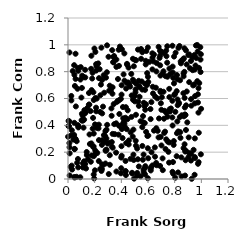
| Category | Series 0 |
|---|---|
| 0.03563302966450452 | 0.805 |
| 0.15725470546570997 | 0.641 |
| 0.30591438788167596 | 0.037 |
| 0.44442905802895954 | 0.851 |
| 0.5340514019186466 | 0.691 |
| 0.07893503927534722 | 0.39 |
| 0.6254720741834504 | 0.573 |
| 0.9351083508665092 | 0.811 |
| 0.5096278023998341 | 0.248 |
| 0.7646215727333777 | 0.503 |
| 0.44600414170575103 | 0.446 |
| 0.7216394145949058 | 0.343 |
| 0.8320018416825582 | 0.561 |
| 0.32900688421911745 | 0.241 |
| 0.709395573126925 | 0.785 |
| 0.2827878612417799 | 0.21 |
| 0.5443690685158465 | 0.43 |
| 0.6652407143829242 | 0.103 |
| 0.4169189847666831 | 0.78 |
| 0.5574837324675022 | 0.246 |
| 0.40282279622567524 | 0.173 |
| 0.6108446168091833 | 0.873 |
| 0.8815692867406937 | 0.477 |
| 0.012519489059148002 | 0.191 |
| 0.10437489069999399 | 0.679 |
| 0.7888248850764427 | 0.039 |
| 0.5953873154129009 | 0.321 |
| 0.1165228921376896 | 0.383 |
| 0.0777591043655525 | 0.384 |
| 0.49057272217372655 | 0.368 |
| 0.5478502889428372 | 0.969 |
| 0.19061189964677616 | 0.646 |
| 0.9052758802610906 | 0.31 |
| 0.07208225706951615 | 0.829 |
| 0.5364906254664229 | 0.686 |
| 0.34676503743022435 | 0.409 |
| 0.34072524804923493 | 0.869 |
| 0.4935841741137938 | 0.84 |
| 0.6264411466432885 | 0.2 |
| 0.07679006643516732 | 0.806 |
| 0.05717907458786809 | 0.298 |
| 0.700557759395515 | 0.516 |
| 0.5834725574929299 | 0.881 |
| 0.07466112687250843 | 0.149 |
| 0.7198555151066441 | 0.449 |
| 0.8417674934536472 | 0.349 |
| 0.04613624099264977 | 0.848 |
| 0.1455468854350774 | 0.529 |
| 0.853430407727154 | 0.475 |
| 0.6325949767257182 | 0.937 |
| 0.20612186753274078 | 0.604 |
| 0.881762902901905 | 0.211 |
| 0.06862611128302931 | 0.121 |
| 0.8667332366656515 | 0.23 |
| 0.5444251770319276 | 0.02 |
| 0.7838020714236587 | 0.053 |
| 0.5240308898563995 | 0.147 |
| 0.8744443689488591 | 0.604 |
| 0.05657004191745656 | 0.934 |
| 0.6447943794131817 | 0.36 |
| 0.2715642921101478 | 0.643 |
| 0.3453617172842169 | 0.917 |
| 0.9234217345973891 | 0.189 |
| 0.2285788836759919 | 0.378 |
| 0.20183481233485892 | 0.065 |
| 0.12916570348441983 | 0.492 |
| 0.8670602330831357 | 0.765 |
| 0.37488271229091713 | 0.745 |
| 0.18407499231285784 | 0.792 |
| 0.20259699793496067 | 0.407 |
| 0.5113440360093787 | 0.711 |
| 0.695132469357539 | 0.313 |
| 0.18132555514791554 | 0.749 |
| 0.24702895944130027 | 0.704 |
| 0.40399143325103937 | 0.372 |
| 0.046087987345045656 | 0.328 |
| 0.506792610633061 | 0.668 |
| 0.9825010202327943 | 0.827 |
| 0.8259075600507771 | 0.049 |
| 0.652661549607466 | 0.166 |
| 0.516196099518228 | 0.023 |
| 0.8726493535969565 | 0.799 |
| 0.8147084099534795 | 0.17 |
| 0.6014727990503329 | 0.154 |
| 0.49056151615090515 | 0.181 |
| 0.19343805210877565 | 0.17 |
| 0.3799780550042329 | 0.963 |
| 0.9100119515219347 | 0.193 |
| 0.27907445741111997 | 0.32 |
| 0.8308764308485884 | 0.569 |
| 0.19651179912720457 | 0.004 |
| 0.8203457588522839 | 0.743 |
| 0.9384938945323787 | 0.697 |
| 0.1983085175587379 | 0.972 |
| 0.9420459151622673 | 0.217 |
| 0.948632118701561 | 0.925 |
| 0.02903005044382853 | 0.363 |
| 0.923114341552792 | 0.595 |
| 0.7459756437684457 | 0.464 |
| 0.4777339687497904 | 0.623 |
| 0.43054982523759133 | 0.057 |
| 0.43170767440450586 | 0.457 |
| 0.2554476945530713 | 0.109 |
| 0.4024363384870739 | 0.699 |
| 0.6966495696412025 | 0.565 |
| 0.1613771927019352 | 0.332 |
| 0.21165359271136697 | 0.808 |
| 0.3963635155993166 | 0.597 |
| 0.46941298226638856 | 0.348 |
| 0.8820308309478597 | 0.14 |
| 0.7824669315075276 | 0.459 |
| 0.44014120768382853 | 0.717 |
| 0.25041341025791447 | 0.979 |
| 0.5015383314833852 | 0.579 |
| 0.7653703418222585 | 0.781 |
| 0.20358605201255797 | 0.186 |
| 0.3630327553735267 | 0.056 |
| 0.8152538842195785 | 0.655 |
| 0.17556850507719263 | 0.175 |
| 0.4328513422570683 | 0.058 |
| 0.010266241414984313 | 0.268 |
| 0.7216116522842217 | 0.938 |
| 0.9221885897266981 | 0.138 |
| 0.5793351780751608 | 0.516 |
| 0.31307573939561534 | 0.695 |
| 0.2138391260776985 | 0.839 |
| 0.3735617436172606 | 0.582 |
| 0.011008889289695527 | 0.943 |
| 0.8846860983848713 | 0.365 |
| 0.2807629415855507 | 0.357 |
| 0.9844252891726221 | 0.715 |
| 0.7968187977232787 | 0.626 |
| 0.43157071224319604 | 0.134 |
| 0.20532045447148634 | 0.947 |
| 0.8225814183010978 | 0.55 |
| 0.7384080433089355 | 0.915 |
| 0.6728793603267023 | 0.359 |
| 0.21057979706823254 | 0.532 |
| 0.5780158165397067 | 0.664 |
| 0.5922188670633197 | 0.7 |
| 0.9788437487020605 | 0.677 |
| 0.5858339328218688 | 0.351 |
| 0.36703647269313144 | 0.575 |
| 0.23711753986353387 | 0.819 |
| 0.569033431424668 | 0.568 |
| 0.040454871515054766 | 0.293 |
| 0.974338953810855 | 0.631 |
| 0.456478630369994 | 0.287 |
| 0.24212569490626637 | 0.076 |
| 0.26909047843936196 | 0.327 |
| 0.7474323135710214 | 0.279 |
| 0.14136893046923868 | 0.178 |
| 0.9495105727749563 | 0.031 |
| 0.5275154171254685 | 0.577 |
| 0.44006459427832584 | 0.372 |
| 0.8386461248547867 | 0.461 |
| 0.6629088393247221 | 0.802 |
| 0.4957352171128078 | 0.003 |
| 0.4938256890846566 | 0.726 |
| 0.38227632549541446 | 0.843 |
| 0.049520682179997846 | 0.011 |
| 0.11745239315813702 | 0.759 |
| 0.7613593107569053 | 0.519 |
| 0.7459999700498012 | 0.762 |
| 0.8854379822208005 | 0.208 |
| 0.2542735645275871 | 0.074 |
| 0.04788185699979842 | 0.419 |
| 0.598978069813513 | 0.98 |
| 0.9795716258534691 | 0.126 |
| 0.2929157352323847 | 0.996 |
| 0.6900919024135728 | 0.955 |
| 0.10059475263461078 | 0.607 |
| 0.26254674912036746 | 0.539 |
| 0.7315642364723096 | 0.223 |
| 0.5481818017063093 | 0.896 |
| 0.5938202570976902 | 0.789 |
| 0.02793645959232622 | 0.1 |
| 0.36150511948355074 | 0.415 |
| 0.48732592023902943 | 0.591 |
| 0.5757007799252084 | 0.417 |
| 0.2676635024097591 | 0.774 |
| 0.12086776030227603 | 0.442 |
| 0.8782469905607037 | 0.026 |
| 0.8405641931578546 | 0.736 |
| 0.7950499140761986 | 0.713 |
| 0.7278126319315674 | 0.353 |
| 0.17115419369886564 | 0.129 |
| 0.022932409541389347 | 0.324 |
| 0.9694812066911285 | 0.729 |
| 0.5367169282239092 | 0.613 |
| 0.17507905280692734 | 0.265 |
| 0.3131967644961714 | 0.177 |
| 0.5669103606655168 | 0.182 |
| 0.1928892950751433 | 0.034 |
| 0.879530991236594 | 0.205 |
| 0.8271180111415063 | 0.354 |
| 0.2882903429011712 | 0.302 |
| 0.4745602771057324 | 0.783 |
| 0.7849345924758124 | 0.838 |
| 0.5025547744859902 | 0.888 |
| 0.6021950732527096 | 0.723 |
| 0.3014052505391087 | 0.271 |
| 0.4358913917001129 | 0.674 |
| 0.507910574968093 | 0.285 |
| 0.3969783337334159 | 0.042 |
| 0.2646050397892574 | 0.106 |
| 0.0005574729176645356 | 0.315 |
| 0.313532790448222 | 0.106 |
| 0.6694866761948005 | 0.601 |
| 0.342883475329843 | 0.558 |
| 0.8519406687588789 | 0.02 |
| 0.5303410280447448 | 0.732 |
| 0.5572700705394731 | 0.386 |
| 0.7009646558975562 | 0.25 |
| 0.44796516853020724 | 0.512 |
| 0.42274635812048394 | 0.936 |
| 0.012529329909304998 | 0.026 |
| 0.0245749698531523 | 0.619 |
| 0.602326077256067 | 0.324 |
| 0.6512072730822507 | 0.235 |
| 0.6233127587818089 | 0.088 |
| 0.37947488451029465 | 0.33 |
| 0.41179851804807915 | 0.536 |
| 0.003611323676144655 | 0.394 |
| 0.17317977715319022 | 0.821 |
| 0.5099137580260154 | 0.885 |
| 0.15988606194727195 | 0.555 |
| 0.211175598901983 | 0.505 |
| 0.1281676497530065 | 0.814 |
| 0.7376308685766668 | 0.494 |
| 0.7720333134261967 | 0.526 |
| 0.6195118935137789 | 0.077 |
| 0.048982232315203385 | 0.222 |
| 0.32102537646652235 | 0.661 |
| 0.2562054198628006 | 0.489 |
| 0.4551969705650018 | 0.257 |
| 0.7093359182497552 | 0.154 |
| 0.75792692565497 | 0.122 |
| 0.7365395766182852 | 0.957 |
| 0.7159463593079847 | 0.803 |
| 0.51873906147359 | 0.227 |
| 0.42366907079564203 | 0.733 |
| 0.5673319027242409 | 0.052 |
| 0.18889241934662354 | 0.239 |
| 0.2197120930957334 | 0.194 |
| 0.128715253506514 | 0.111 |
| 0.690650452279434 | 0.097 |
| 0.2314413330652895 | 0.405 |
| 0.09195891316836974 | 0.013 |
| 0.5984238046564304 | 0.006 |
| 0.694457885708973 | 0.648 |
| 0.2408471491853137 | 0.5 |
| 0.11260882861839408 | 0.086 |
| 0.8436016047949935 | 0.307 |
| 0.6985252735834838 | 0.95 |
| 0.80243701097228 | 0.634 |
| 0.5797758974919436 | 0.096 |
| 0.9562078556034115 | 0.846 |
| 0.9223339599110065 | 0.88 |
| 0.7604258070665407 | 0.61 |
| 0.8284535498763268 | 0.977 |
| 0.6867192214500074 | 0.902 |
| 0.7529465901011347 | 0.202 |
| 0.33455310354635626 | 0.336 |
| 0.5314072960723647 | 0.093 |
| 0.10789472090017038 | 0.436 |
| 0.293630596018723 | 0.404 |
| 0.02518692620950425 | 0.586 |
| 0.951848482008087 | 0.564 |
| 0.25505948593582295 | 0.738 |
| 0.9747641722720838 | 0.57 |
| 0.0557906952787155 | 0.298 |
| 0.711023790113029 | 0.066 |
| 0.04793591548597913 | 0.777 |
| 0.8900216219620398 | 0.854 |
| 0.25499612887224316 | 0.289 |
| 0.15642243299990227 | 0.554 |
| 0.33921064785245064 | 0.871 |
| 0.6329181984823714 | 0.817 |
| 0.33126710947712823 | 0.96 |
| 0.23109765785387412 | 0.134 |
| 0.8498076276016545 | 0.161 |
| 0.5059089369762515 | 0.646 |
| 0.8624726256687688 | 0.892 |
| 0.4013359382570367 | 0.245 |
| 0.13162641318208185 | 0.497 |
| 0.6182379878813861 | 0.521 |
| 0.4764774288556958 | 0.463 |
| 0.05052740854410845 | 0.224 |
| 0.9750081381616671 | 0.113 |
| 0.5187729486442696 | 0.045 |
| 0.4933816770562184 | 0.142 |
| 0.760512002606415 | 0.823 |
| 0.2141794405450376 | 0.381 |
| 0.5314142843297285 | 0.545 |
| 0.6198059575564631 | 0.446 |
| 0.653344253120859 | 0.615 |
| 0.5664838800685154 | 0.07 |
| 0.5873613995009107 | 0.954 |
| 0.1350972405354689 | 0.078 |
| 0.736805000963697 | 0.296 |
| 0.5013211644831052 | 0.621 |
| 0.3272702271633906 | 0.471 |
| 0.8697720512573691 | 0.467 |
| 0.48040063664341437 | 0.046 |
| 0.17538542395401033 | 0.919 |
| 0.3039389120748949 | 0.911 |
| 0.7830865406310932 | 0.993 |
| 0.6337103809996529 | 0.905 |
| 0.993908060345206 | 0.89 |
| 0.05163631632914163 | 0.693 |
| 0.5740055816568224 | 0.543 |
| 0.42490728968316016 | 0.39 |
| 0.4091902081889267 | 0.305 |
| 0.43420789183573444 | 0.029 |
| 0.5775258174955324 | 0.035 |
| 0.19342545939076447 | 0.589 |
| 0.3629497424795316 | 0.836 |
| 0.959554842559549 | 0.995 |
| 0.8744027072092061 | 0.259 |
| 0.25067901260069686 | 0.06 |
| 0.05683946911173523 | 0.746 |
| 0.8217925767364603 | 0.593 |
| 0.4855958588978033 | 0.316 |
| 0.14027993346530274 | 0.201 |
| 0.2427795825093962 | 0.624 |
| 0.07655118207465719 | 0.087 |
| 0.6447244011553399 | 0.927 |
| 0.5786906137587574 | 0.709 |
| 0.6592831777167175 | 0.68 |
| 0.4342654209563518 | 0.535 |
| 0.9922312821111346 | 0.983 |
| 0.9277749944670275 | 0.001 |
| 0.4231945154855341 | 0.413 |
| 0.01086705372507351 | 0.428 |
| 0.9513267593406427 | 0.302 |
| 0.38275620015818584 | 0.587 |
| 0.6797627918332869 | 0.985 |
| 0.9724298477668297 | 0.95 |
| 0.10433711230629453 | 0.486 |
| 0.0748666413072164 | 0.401 |
| 0.16410124581590813 | 0.261 |
| 0.3606279211977672 | 0.196 |
| 0.48682916046004615 | 0.896 |
| 0.8037300707078101 | 0.009 |
| 0.7439009660855376 | 0.867 |
| 0.3904900566429923 | 0.972 |
| 0.5625858119689862 | 0.469 |
| 0.946579590666628 | 0.705 |
| 0.7874268681181444 | 0.126 |
| 0.6792330957768924 | 0.31 |
| 0.18503096642113592 | 0.375 |
| 0.9808727107591058 | 0.345 |
| 0.32845741310752624 | 0.275 |
| 0.7953689488854828 | 0.913 |
| 0.7313190142640936 | 0.767 |
| 0.7936542421111711 | 0.283 |
| 0.7237428150495168 | 0.508 |
| 0.007584717321694896 | 0.393 |
| 0.4366114385954635 | 0.268 |
| 0.8769785914278284 | 0.481 |
| 0.6912296006285414 | 0.847 |
| 0.7039255273517013 | 0.61 |
| 0.9519490435236196 | 0.157 |
| 0.48733910987513346 | 0.74 |
| 0.5830640754805679 | 0.854 |
| 0.06522409125087772 | 0.281 |
| 0.05891495219034428 | 0.541 |
| 0.9037024288878586 | 0.163 |
| 0.7592603970731653 | 0.672 |
| 0.8049713732043522 | 0.501 |
| 0.5569273766421193 | 0.945 |
| 0.9089840911533312 | 0.722 |
| 0.28877277461813117 | 0.368 |
| 0.5249818244414187 | 0.964 |
| 0.19204042486231032 | 0.242 |
| 0.18792496951301238 | 0.455 |
| 0.7859463342809258 | 0.793 |
| 0.22704405631666255 | 0.861 |
| 0.0116680905359288 | 0.236 |
| 0.6932412210827171 | 0.771 |
| 0.41420133352761423 | 0.452 |
| 0.10946577729115292 | 0.435 |
| 0.21096971327528388 | 0.856 |
| 0.996487624812944 | 0.184 |
| 0.8946709214049935 | 0.422 |
| 0.9025720755159009 | 0.924 |
| 0.6613435397877716 | 0.12 |
| 0.12971264117875198 | 0.757 |
| 0.8361975833811653 | 0.991 |
| 0.8451576792464932 | 0.876 |
| 0.3352131843278119 | 0.233 |
| 0.6625032496590543 | 0.378 |
| 0.599491164879783 | 0.762 |
| 0.4660603423222704 | 0.689 |
| 0.2915982257335214 | 0.796 |
| 0.4515146889561177 | 0.719 |
| 0.48136392587981724 | 0.041 |
| 0.020085167966461055 | 0.091 |
| 0.8172231142759561 | 0.775 |
| 0.2850305880861073 | 0.755 |
| 0.4043866458823481 | 0.967 |
| 0.784346113505831 | 0.399 |
| 0.8731682782325872 | 0.974 |
| 0.3851934162484314 | 0.484 |
| 0.5529397167340958 | 0.727 |
| 0.9330599009858545 | 0.907 |
| 0.6357515468751586 | 0.687 |
| 0.7826473626687894 | 0.583 |
| 0.0044690605382460774 | 0.434 |
| 0.1207060477242378 | 0.132 |
| 0.6930788836665565 | 0.657 |
| 0.2969562752617016 | 0.264 |
| 0.27370327637094827 | 0.277 |
| 0.8653336044353431 | 0.639 |
| 0.9964753408185877 | 0.93 |
| 0.2153561302551363 | 0.599 |
| 0.9497723236907527 | 0.815 |
| 0.6914853348807706 | 0.921 |
| 0.41836379576152954 | 0.426 |
| 0.4425550789377365 | 0.858 |
| 0.06494032317075081 | 0.016 |
| 0.12282620969115982 | 0.513 |
| 0.5571712458515781 | 0.666 |
| 0.11209407800486872 | 0.118 |
| 0.10996349321437712 | 0.473 |
| 0.6207159801741702 | 0.064 |
| 0.23237988545417773 | 0.752 |
| 0.45802438684461444 | 0.707 |
| 0.454273555592939 | 0.83 |
| 0.11471077224702414 | 0.441 |
| 0.3511081279977127 | 0.334 |
| 0.8851303554977431 | 0.958 |
| 0.1930128685593802 | 0.339 |
| 0.8071347555982133 | 0.941 |
| 0.32562476280472585 | 0.526 |
| 0.8664629832888565 | 0.787 |
| 0.8198312944952835 | 0.429 |
| 0.10206029775569704 | 0.438 |
| 0.9982319626118169 | 0.523 |
| 0.09554324575798391 | 0.834 |
| 0.33331839076790826 | 0.636 |
| 0.9616294371567543 | 0.902 |
| 0.978444188337748 | 0.495 |
| 0.1493160588495514 | 0.146 |
| 0.8469003443288069 | 0.862 |
| 0.994249274136531 | 0.797 |
| 0.10619791453866156 | 0.77 |
| 0.8172893917611077 | 0.341 |
| 0.39921409726414875 | 0.08 |
| 0.46908411457433297 | 0.15 |
| 0.1689619579568536 | 0.506 |
| 0.04756132354658315 | 0.015 |
| 0.07127633886611802 | 0.673 |
| 0.7446247070676865 | 0.989 |
| 0.2046603228727309 | 0.212 |
| 0.8697422869491769 | 0.899 |
| 0.38292021036468565 | 0.396 |
| 0.5622327210181942 | 0.424 |
| 0.7889932361414783 | 0.753 |
| 0.8761381477012877 | 0.533 |
| 0.6332193884908315 | 0.101 |
| 0.7587608758511319 | 0.273 |
| 0.23199054675420633 | 0.29 |
| 0.1171376210673989 | 0.483 |
| 0.5770900590585127 | 0.082 |
| 0.9689155489687573 | 0.999 |
| 0.40163583354537924 | 0.629 |
| 0.890681307694469 | 0.652 |
| 0.2544782081637083 | 0.254 |
| 0.28915161482548163 | 0.218 |
| 0.34123891969535974 | 0.909 |
| 0.41152673524219324 | 0.411 |
| 0.9100259312667041 | 0.928 |
| 0.17728498901798603 | 0.663 |
| 0.30849792822954397 | 0.658 |
| 0.7924495351965801 | 0.254 |
| 0.8859930711200099 | 0.549 |
| 0.5097429639025974 | 0.479 |
| 0.09325274618908413 | 0.741 |
| 0.03117565710810131 | 0.071 |
| 0.5611259777638714 | 0.143 |
| 0.9499102138435954 | 0.164 |
| 0.2813078095981095 | 0.116 |
| 0.9529682562104622 | 0.618 |
| 0.925386894094774 | 0.547 |
| 0.8540930413241055 | 0.883 |
| 0.7162909750622759 | 0.65 |
| 0.6376503760180774 | 0.638 |
| 0.5846231153621883 | 0.557 |
| 0.6652291644097992 | 0.864 |
| 0.6827189541276671 | 0.451 |
| 0.6410274290690012 | 0.877 |
| 0.28266889472750867 | 0.215 |
| 0.5986921831132677 | 0.229 |
| 0.3893049764838083 | 0.987 |
| 0.33428067900828884 | 0.683 |
| 0.3629972393716073 | 0.89 |
| 0.915005927565655 | 0.826 |
| 0.39927718558609027 | 0.16 |